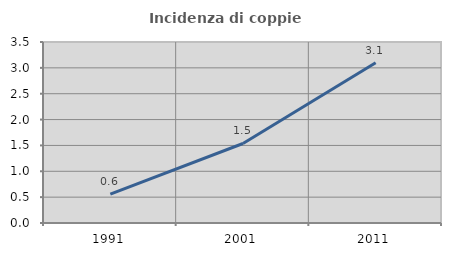
| Category | Incidenza di coppie miste |
|---|---|
| 1991.0 | 0.558 |
| 2001.0 | 1.537 |
| 2011.0 | 3.097 |